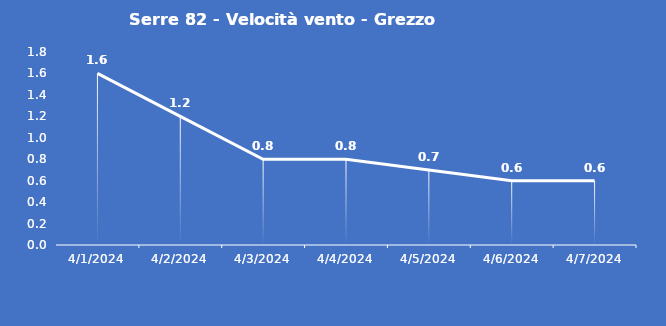
| Category | Serre 82 - Velocità vento - Grezzo (m/s) |
|---|---|
| 4/1/24 | 1.6 |
| 4/2/24 | 1.2 |
| 4/3/24 | 0.8 |
| 4/4/24 | 0.8 |
| 4/5/24 | 0.7 |
| 4/6/24 | 0.6 |
| 4/7/24 | 0.6 |